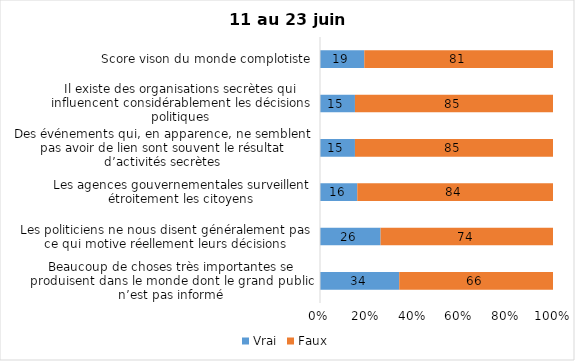
| Category | Vrai | Faux |
|---|---|---|
| Beaucoup de choses très importantes se produisent dans le monde dont le grand public n’est pas informé | 34 | 66 |
| Les politiciens ne nous disent généralement pas ce qui motive réellement leurs décisions | 26 | 74 |
| Les agences gouvernementales surveillent étroitement les citoyens | 16 | 84 |
| Des événements qui, en apparence, ne semblent pas avoir de lien sont souvent le résultat d’activités secrètes | 15 | 85 |
| Il existe des organisations secrètes qui influencent considérablement les décisions politiques | 15 | 85 |
| Score vison du monde complotiste | 19 | 81 |